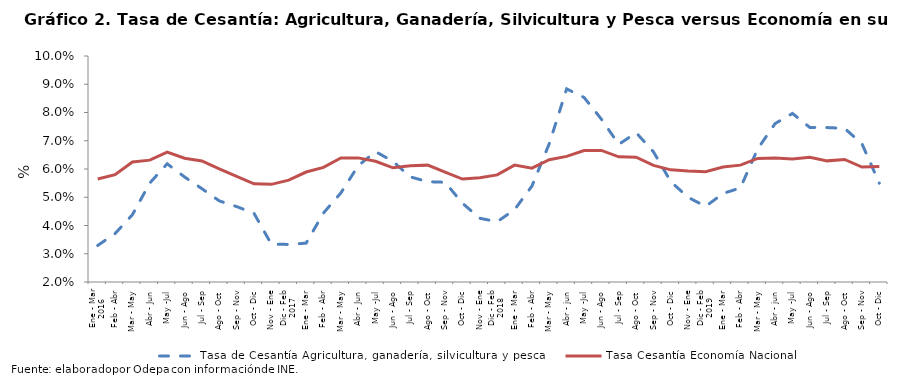
| Category | Tasa de Cesantía Agricultura, ganadería, silvicultura y pesca |
|---|---|
| 0 | 0.033 |
| 1 | 0.037 |
| 2 | 0.044 |
| 3 | 0.055 |
| 4 | 0.062 |
| 5 | 0.057 |
| 6 | 0.053 |
| 7 | 0.049 |
| 8 | 0.047 |
| 9 | 0.044 |
| 10 | 0.033 |
| 11 | 0.033 |
| 12 | 0.034 |
| 13 | 0.044 |
| 14 | 0.052 |
| 15 | 0.061 |
| 16 | 0.066 |
| 17 | 0.063 |
| 18 | 0.057 |
| 19 | 0.055 |
| 20 | 0.055 |
| 21 | 0.048 |
| 22 | 0.043 |
| 23 | 0.041 |
| 24 | 0.046 |
| 25 | 0.054 |
| 26 | 0.069 |
| 27 | 0.088 |
| 28 | 0.085 |
| 29 | 0.078 |
| 30 | 0.069 |
| 31 | 0.073 |
| 32 | 0.066 |
| 33 | 0.055 |
| 34 | 0.05 |
| 35 | 0.047 |
| 36 | 0.051 |
| 37 | 0.053 |
| 38 | 0.067 |
| 39 | 0.076 |
| 40 | 0.08 |
| 41 | 0.075 |
| 42 | 0.075 |
| 43 | 0.074 |
| 44 | 0.069 |
| 45 | 0.055 |